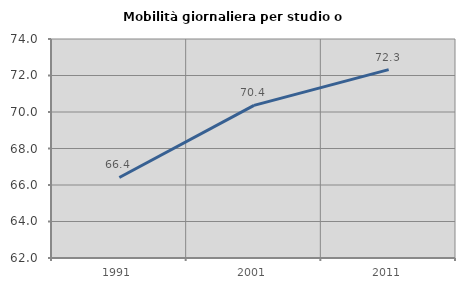
| Category | Mobilità giornaliera per studio o lavoro |
|---|---|
| 1991.0 | 66.413 |
| 2001.0 | 70.363 |
| 2011.0 | 72.322 |